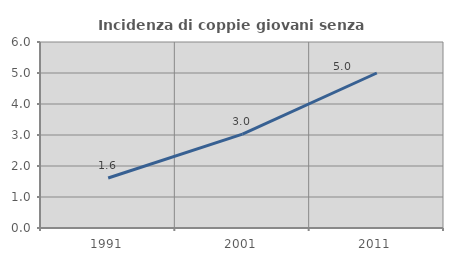
| Category | Incidenza di coppie giovani senza figli |
|---|---|
| 1991.0 | 1.613 |
| 2001.0 | 3.03 |
| 2011.0 | 5 |